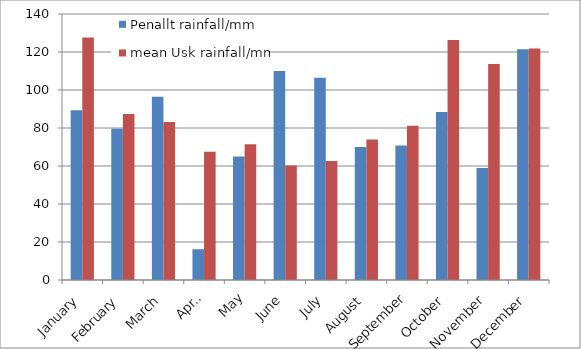
| Category | Penallt rainfall/mm | mean Usk rainfall/mm |
|---|---|---|
| January | 89.4 | 127.6 |
| February | 79.6 | 87.4 |
| March | 96.4 | 83.1 |
| April | 16.2 | 67.5 |
| May | 65 | 71.5 |
| June | 110 | 60.2 |
| July | 106.4 | 62.6 |
| August | 70 | 73.9 |
| September | 70.8 | 81.2 |
| October | 88.4 | 126.3 |
| November | 59 | 113.7 |
| December | 121.4 | 121.9 |